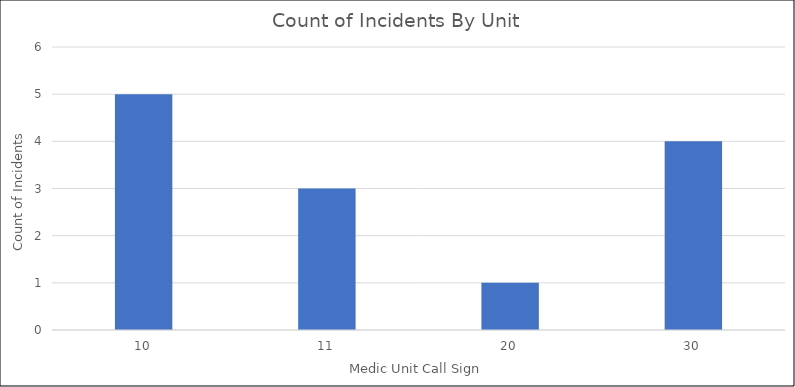
| Category | Total |
|---|---|
| 10 | 5 |
| 11 | 3 |
| 20 | 1 |
| 30 | 4 |